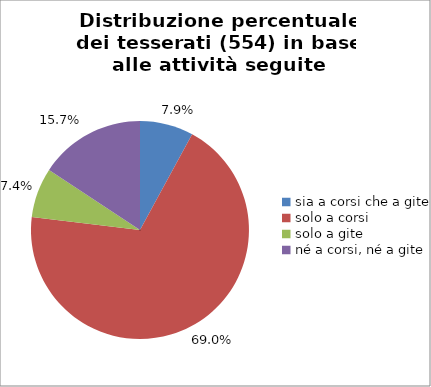
| Category | Nr. Tesserati |
|---|---|
| sia a corsi che a gite | 44 |
| solo a corsi | 382 |
| solo a gite | 41 |
| né a corsi, né a gite | 87 |